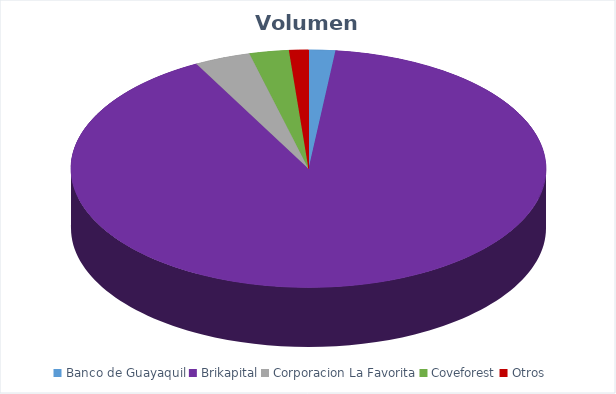
| Category | VOLUMEN ($USD) |
|---|---|
| Banco de Guayaquil | 6745.96 |
| Brikapital | 337000 |
| Corporacion La Favorita | 14236.2 |
| Coveforest | 10002.2 |
| Otros | 4900 |